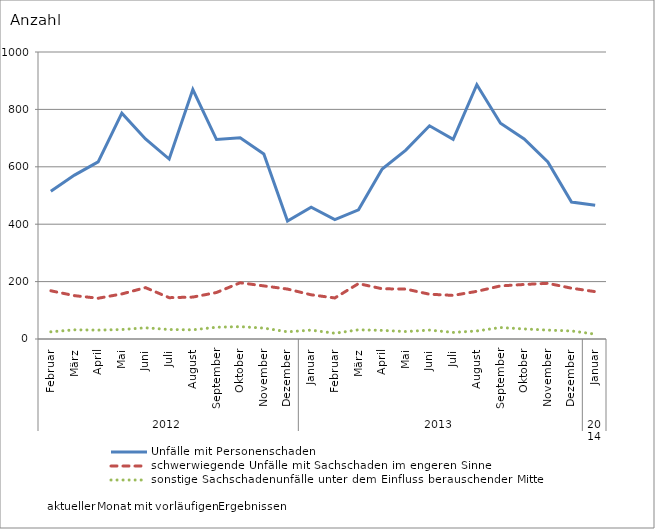
| Category | Unfälle mit Personenschaden | schwerwiegende Unfälle mit Sachschaden im engeren Sinne | sonstige Sachschadenunfälle unter dem Einfluss berauschender Mittel |
|---|---|---|---|
| 0 | 515 | 168 | 25 |
| 1 | 571 | 151 | 32 |
| 2 | 617 | 142 | 31 |
| 3 | 787 | 157 | 33 |
| 4 | 697 | 179 | 39 |
| 5 | 627 | 144 | 33 |
| 6 | 869 | 146 | 32 |
| 7 | 695 | 162 | 41 |
| 8 | 701 | 196 | 43 |
| 9 | 645 | 185 | 38 |
| 10 | 411 | 174 | 25 |
| 11 | 459 | 154 | 31 |
| 12 | 416 | 143 | 20 |
| 13 | 450 | 193 | 32 |
| 14 | 592 | 175 | 30 |
| 15 | 658 | 174 | 26 |
| 16 | 743 | 156 | 31 |
| 17 | 696 | 152 | 23 |
| 18 | 886 | 166 | 28 |
| 19 | 752 | 185 | 40 |
| 20 | 697 | 190 | 35 |
| 21 | 617 | 194 | 31 |
| 22 | 477 | 177 | 28 |
| 23 | 466 | 165 | 17 |